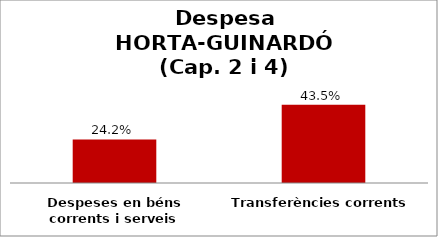
| Category | Series 0 |
|---|---|
| Despeses en béns corrents i serveis | 0.242 |
| Transferències corrents | 0.435 |